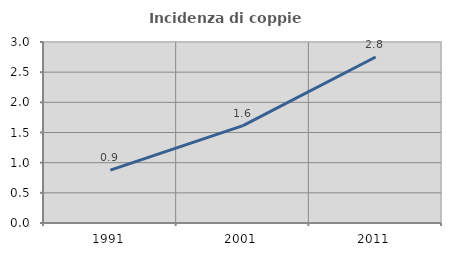
| Category | Incidenza di coppie miste |
|---|---|
| 1991.0 | 0.877 |
| 2001.0 | 1.614 |
| 2011.0 | 2.752 |